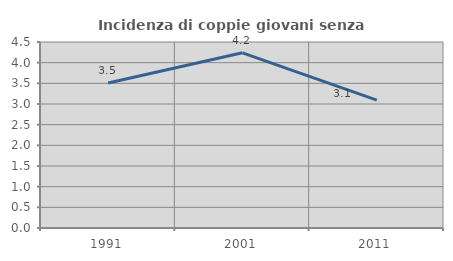
| Category | Incidenza di coppie giovani senza figli |
|---|---|
| 1991.0 | 3.509 |
| 2001.0 | 4.239 |
| 2011.0 | 3.095 |